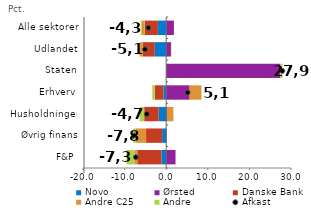
| Category | Novo | Ørsted | Danske Bank | Andre C25 | Andre |
|---|---|---|---|---|---|
| F&P | -1.136 | 2.244 | -5.803 | -0.732 | -1.869 |
| Øvrig finans | -0.982 | 0.133 | -3.86 | -2.495 | -0.553 |
| Husholdninger | -1.812 | 0.182 | -3.473 | 1.554 | -1.121 |
| Erhverv | -0.67 | 5.628 | -2.096 | 2.847 | -0.575 |
| Staten | -0.009 | 27.42 | -0.019 | -0.005 | 0.523 |
| Udlandet | -2.739 | 1.143 | -2.899 | -0.729 | 0.112 |
| Alle sektorer | -1.997 | 1.855 | -3.172 | -0.706 | -0.277 |